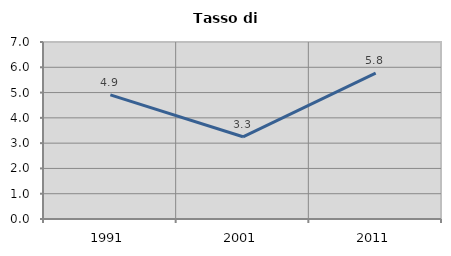
| Category | Tasso di disoccupazione   |
|---|---|
| 1991.0 | 4.906 |
| 2001.0 | 3.251 |
| 2011.0 | 5.77 |